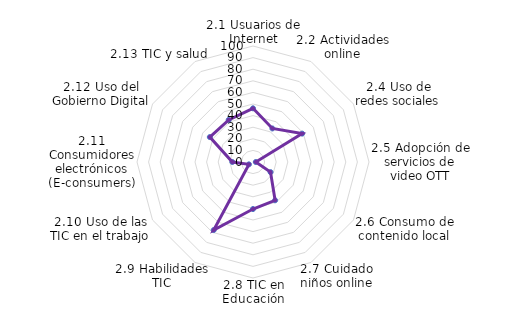
| Category | NACIONAL |
|---|---|
| 2.1 Usuarios de Internet | 46.28 |
| 2.2 Actividades online | 33.39 |
| 2.4 Uso de redes sociales | 48.924 |
| 2.5 Adopción de servicios de video OTT | 2.42 |
| 2.6 Consumo de contenido local | 17.44 |
| 2.7 Cuidado niños online | 38.1 |
| 2.8 TIC en Educación | 40.54 |
| 2.9 Habilidades TIC | 67.76 |
| 2.10 Uso de las TIC en el trabajo | 4.07 |
| 2.11 Consumidores electrónicos (E-consumers) | 17.803 |
| 2.12 Uso del Gobierno Digital | 42.97 |
| 2.13 TIC y salud | 41.9 |